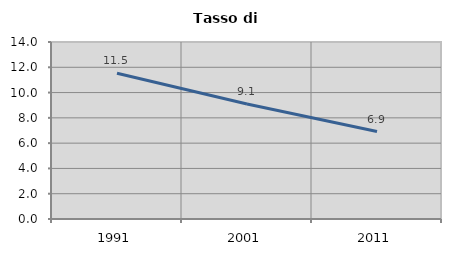
| Category | Tasso di disoccupazione   |
|---|---|
| 1991.0 | 11.524 |
| 2001.0 | 9.091 |
| 2011.0 | 6.915 |